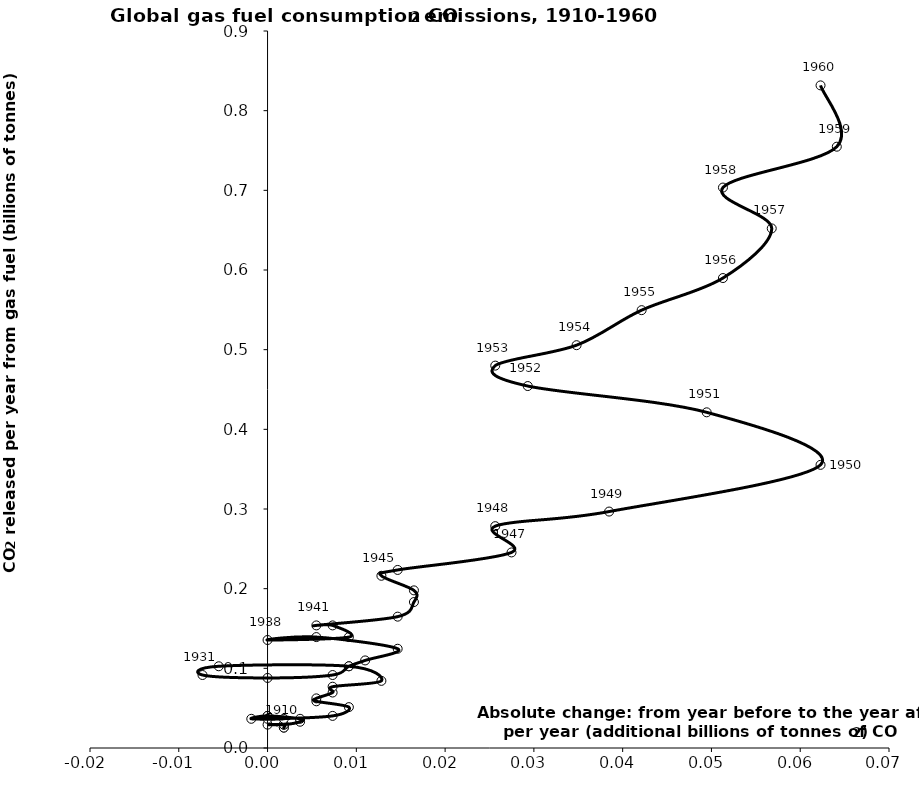
| Category | Series 0 |
|---|---|
| 0.0018320000000000003 | 0.026 |
| 0.0018320000000000003 | 0.026 |
| 0.0018320000000000003 | 0.029 |
| 0.0 | 0.029 |
| 0.0018319999999999986 | 0.029 |
| 0.003663999999999999 | 0.033 |
| 0.0036640000000000006 | 0.037 |
| 0.0 | 0.04 |
| -0.0018320000000000003 | 0.037 |
| 0.0018320000000000003 | 0.037 |
| 0.0 | 0.04 |
| 0.0 | 0.037 |
| 0.007328000000000001 | 0.04 |
| 0.009160000000000001 | 0.051 |
| 0.005496000000000004 | 0.059 |
| 0.005495999999999997 | 0.062 |
| 0.007328000000000001 | 0.07 |
| 0.007328000000000001 | 0.077 |
| 0.012823999999999995 | 0.084 |
| 0.009160000000000001 | 0.103 |
| -0.005495999999999994 | 0.103 |
| -0.007328000000000001 | 0.092 |
| 0.0 | 0.088 |
| 0.007328000000000001 | 0.092 |
| 0.009159999999999995 | 0.103 |
| 0.010992000000000009 | 0.11 |
| 0.014655999999999995 | 0.125 |
| 0.005495999999999987 | 0.139 |
| 0.0 | 0.136 |
| 0.009160000000000015 | 0.139 |
| 0.007328000000000015 | 0.154 |
| 0.005495999999999987 | 0.154 |
| 0.014656000000000002 | 0.165 |
| 0.016488000000000003 | 0.183 |
| 0.01648799999999999 | 0.198 |
| 0.012824000000000002 | 0.216 |
| 0.014656000000000002 | 0.224 |
| 0.02747999999999999 | 0.245 |
| 0.025648000000000018 | 0.278 |
| 0.038472000000000006 | 0.297 |
| 0.06228799999999998 | 0.355 |
| 0.04946400000000001 | 0.421 |
| 0.029312000000000005 | 0.454 |
| 0.025648000000000032 | 0.48 |
| 0.03480799999999998 | 0.506 |
| 0.04213599999999995 | 0.55 |
| 0.05129600000000001 | 0.59 |
| 0.05679200000000001 | 0.652 |
| 0.05129600000000001 | 0.703 |
| 0.06412000000000001 | 0.755 |
| 0.06228800000000001 | 0.832 |